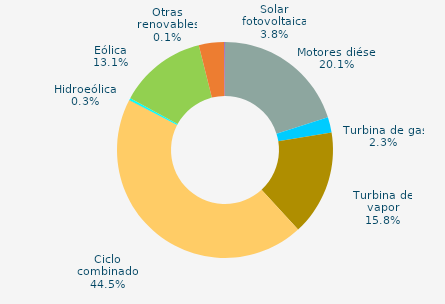
| Category | Series 0 |
|---|---|
| Motores diésel | 20.1 |
| Turbina de gas | 2.309 |
| Turbina de vapor | 15.76 |
| Ciclo combinado | 44.454 |
| Cogeneración | 0 |
| Hidráulica | 0.044 |
| Hidroeólica | 0.301 |
| Eólica | 13.127 |
| Solar fotovoltaica | 3.781 |
| Otras renovables | 0.124 |